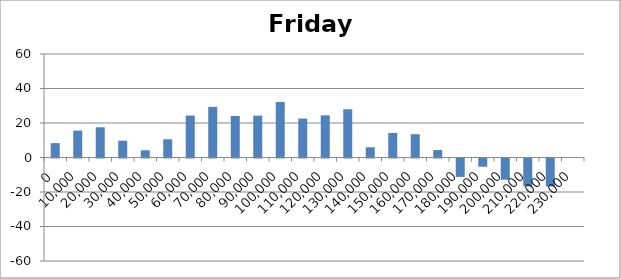
| Category | Friday 96 |
|---|---|
| 0.0 | 8.332 |
| 10000.0 | 15.595 |
| 20000.0 | 17.526 |
| 30000.0 | 9.753 |
| 40000.0 | 4.195 |
| 50000.0 | 10.563 |
| 60000.0 | 24.332 |
| 70000.0 | 29.337 |
| 80000.0 | 24.058 |
| 90000.0 | 24.284 |
| 100000.0 | 32.174 |
| 110000.0 | 22.584 |
| 120000.0 | 24.458 |
| 130000.0 | 27.958 |
| 140000.0 | 5.932 |
| 150000.0 | 14.226 |
| 160000.0 | 13.495 |
| 170000.0 | 4.321 |
| 180000.0 | -10.674 |
| 190000.0 | -4.779 |
| 200000.0 | -12.3 |
| 210000.0 | -16.133 |
| 220000.0 | -16.2 |
| 230000.0 | 0 |